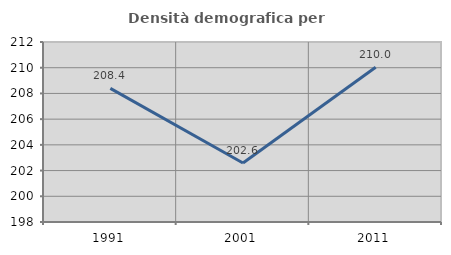
| Category | Densità demografica |
|---|---|
| 1991.0 | 208.392 |
| 2001.0 | 202.587 |
| 2011.0 | 210.039 |